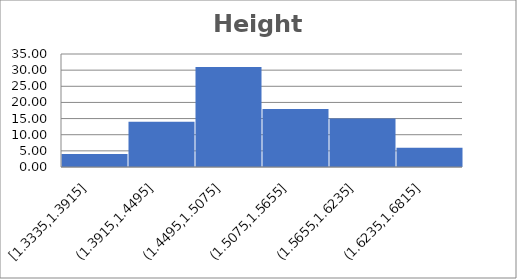
| Category | Weight kg |
|---|---|
| 1.6002 | 49.442 |
| 1.651 | 62.596 |
| 1.651 | 75.75 |
| 1.53034999999999 | 48.988 |
| 1.45415 | 43.091 |
| 1.60655 | 52.617 |
| 1.5621 | 47.967 |
| 1.4986 | 45.586 |
| 1.524 | 47.854 |
| 1.47955 | 44.452 |
| 1.4732 | 46.04 |
| 1.54939999999999 | 53.07 |
| 1.51765 | 65.884 |
| 1.5367 | 46.04 |
| 1.4605 | 43.545 |
| 1.524 | 62.369 |
| 1.4605 | 45.813 |
| 1.58115 | 74.389 |
| 1.524 | 55.565 |
| 1.4986 | 46.153 |
| 1.4859 | 47.854 |
| 1.47955 | 42.184 |
| 1.5875 | 45.813 |
| 1.55575 | 44.679 |
| 1.58115 | 42.638 |
| 1.56845 | 43.545 |
| 1.4986 | 37.308 |
| 1.524 | 39.349 |
| 1.44145 | 39.009 |
| 1.4859 | 40.597 |
| 1.4605 | 38.102 |
| 1.4986 | 40.37 |
| 1.55575 | 37.195 |
| 1.53034999999999 | 44.112 |
| 1.45415 | 33.452 |
| 1.63195 | 47.174 |
| 1.41605 | 30.05 |
| 1.3843 | 32.092 |
| 1.45415 | 34.813 |
| 1.50495 | 35.947 |
| 1.4859 | 39.916 |
| 1.4478 | 32.659 |
| 1.3335 | 30.504 |
| 1.36525 | 29.484 |
| 1.54939999999999 | 44.679 |
| 1.4478 | 34.927 |
| 1.4732 | 54.544 |
| 1.5875 | 52.503 |
| 1.44145 | 51.029 |
| 1.6002 | 51.71 |
| 1.58115 | 60.328 |
| 1.41605 | 47.854 |
| 1.54939999999999 | 69.967 |
| 1.64465 | 77.338 |
| 1.49225 | 58.287 |
| 1.54939999999999 | 45.813 |
| 1.4224 | 47.627 |
| 1.61925 | 53.07 |
| 1.6637 | 80.739 |
| 1.4732 | 45.246 |
| 1.49225 | 50.462 |
| 1.53034999999999 | 52.957 |
| 1.5875 | 61.235 |
| 1.5748 | 59.874 |
| 1.42875 | 47.967 |
| 1.60655 | 63.957 |
| 1.54939999999999 | 46.72 |
| 1.4732 | 41.277 |
| 1.4986 | 45.359 |
| 1.6637 | 57.266 |
| 1.4224 | 38.782 |
| 1.50495 | 46.947 |
| 1.3462 | 29.257 |
| 1.4224 | 35.834 |
| 1.4732 | 34.927 |
| 1.51765 | 38.555 |
| 1.4605 | 40.37 |
| 1.4605 | 36.741 |
| 1.4224 | 37.195 |
| 1.4732 | 39.463 |
| 1.46685 | 36.741 |
| 1.5875 | 44.452 |
| 1.49225 | 41.617 |
| 1.49225 | 39.009 |
| 1.6002 | 41.277 |
| 1.4224 | 38.102 |
| 1.397 | 30.164 |
| 1.4478 | 38.555 |